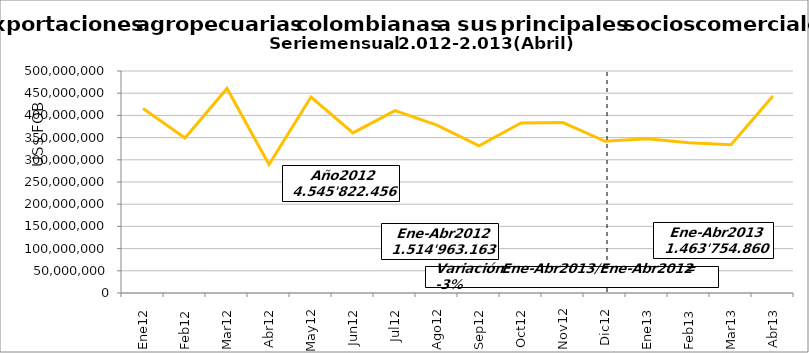
| Category | Series 0 |
|---|---|
| 0 | 415698149 |
| 1 | 349099405 |
| 2 | 460699576 |
| 3 | 289466033 |
| 4 | 441383607 |
| 5 | 360612316 |
| 6 | 410708665 |
| 7 | 378301660 |
| 8 | 331504399 |
| 9 | 382902294 |
| 10 | 383818406 |
| 11 | 341627946 |
| 12 | 347433975.24 |
| 13 | 338612212.5 |
| 14 | 334045493.52 |
| 15 | 443663178.68 |